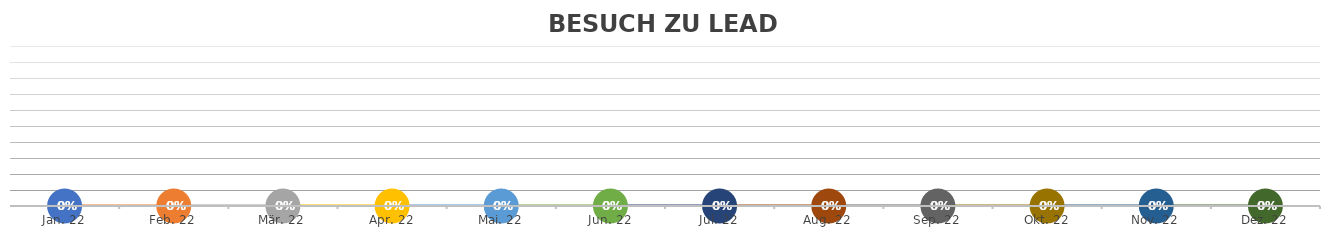
| Category | BESUCH ZU LEAD % |
|---|---|
| 2022-01-18 | 0 |
| 2022-02-18 | 0 |
| 2022-03-18 | 0 |
| 2022-04-18 | 0 |
| 2022-05-18 | 0 |
| 2022-06-18 | 0 |
| 2022-07-18 | 0 |
| 2022-08-18 | 0 |
| 2022-09-18 | 0 |
| 2022-10-18 | 0 |
| 2022-11-18 | 0 |
| 2022-12-18 | 0 |